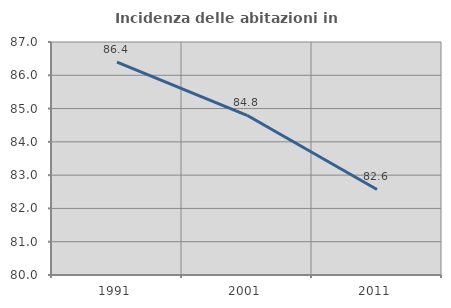
| Category | Incidenza delle abitazioni in proprietà  |
|---|---|
| 1991.0 | 86.398 |
| 2001.0 | 84.797 |
| 2011.0 | 82.571 |